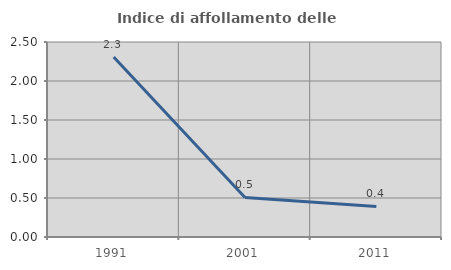
| Category | Indice di affollamento delle abitazioni  |
|---|---|
| 1991.0 | 2.308 |
| 2001.0 | 0.508 |
| 2011.0 | 0.393 |